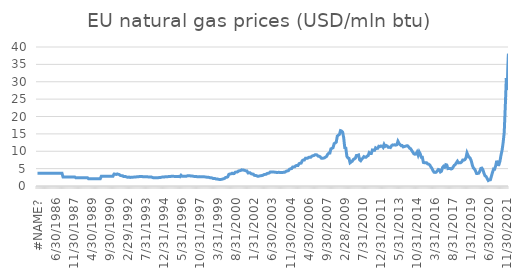
| Category | EU natural gas prices (USD/mln btu) |
|---|---|
| 0.0 | 3.65 |
| 1985-02-28 | 3.65 |
| 1985-03-31 | 3.65 |
| 1985-04-30 | 3.65 |
| 1985-05-31 | 3.65 |
| 1985-06-30 | 3.65 |
| 1985-07-31 | 3.65 |
| 1985-08-31 | 3.65 |
| 1985-09-30 | 3.65 |
| 1985-10-31 | 3.65 |
| 1985-11-30 | 3.65 |
| 1985-12-31 | 3.65 |
| 1986-01-31 | 3.65 |
| 1986-02-28 | 3.65 |
| 1986-03-31 | 3.65 |
| 1986-04-30 | 3.65 |
| 1986-05-31 | 3.65 |
| 1986-06-30 | 3.65 |
| 1986-07-31 | 3.65 |
| 1986-08-31 | 3.65 |
| 1986-09-30 | 3.65 |
| 1986-10-31 | 3.65 |
| 1986-11-30 | 3.65 |
| 1986-12-31 | 3.65 |
| 1987-01-31 | 2.59 |
| 1987-02-28 | 2.59 |
| 1987-03-31 | 2.59 |
| 1987-04-30 | 2.59 |
| 1987-05-31 | 2.59 |
| 1987-06-30 | 2.59 |
| 1987-07-31 | 2.59 |
| 1987-08-31 | 2.59 |
| 1987-09-30 | 2.59 |
| 1987-10-31 | 2.59 |
| 1987-11-30 | 2.59 |
| 1987-12-31 | 2.59 |
| 1988-01-31 | 2.36 |
| 1988-02-29 | 2.36 |
| 1988-03-31 | 2.36 |
| 1988-04-30 | 2.36 |
| 1988-05-31 | 2.36 |
| 1988-06-30 | 2.36 |
| 1988-07-31 | 2.36 |
| 1988-08-31 | 2.36 |
| 1988-09-30 | 2.36 |
| 1988-10-31 | 2.36 |
| 1988-11-30 | 2.36 |
| 1988-12-31 | 2.36 |
| 1989-01-31 | 2.09 |
| 1989-02-28 | 2.09 |
| 1989-03-31 | 2.09 |
| 1989-04-30 | 2.09 |
| 1989-05-31 | 2.09 |
| 1989-06-30 | 2.09 |
| 1989-07-31 | 2.09 |
| 1989-08-31 | 2.09 |
| 1989-09-30 | 2.09 |
| 1989-10-31 | 2.09 |
| 1989-11-30 | 2.09 |
| 1989-12-31 | 2.09 |
| 1990-01-31 | 2.82 |
| 1990-02-28 | 2.82 |
| 1990-03-31 | 2.82 |
| 1990-04-30 | 2.82 |
| 1990-05-31 | 2.82 |
| 1990-06-30 | 2.82 |
| 1990-07-31 | 2.82 |
| 1990-08-31 | 2.82 |
| 1990-09-30 | 2.82 |
| 1990-10-31 | 2.82 |
| 1990-11-30 | 2.82 |
| 1990-12-31 | 2.82 |
| 1991-01-31 | 3.44 |
| 1991-02-28 | 3.41 |
| 1991-03-31 | 3.33 |
| 1991-04-30 | 3.47 |
| 1991-05-31 | 3.37 |
| 1991-06-30 | 3.29 |
| 1991-07-31 | 3 |
| 1991-08-31 | 2.98 |
| 1991-09-30 | 2.97 |
| 1991-10-31 | 2.71 |
| 1991-11-30 | 2.7 |
| 1991-12-31 | 2.7 |
| 1992-01-31 | 2.57 |
| 1992-02-29 | 2.5 |
| 1992-03-31 | 2.58 |
| 1992-04-30 | 2.47 |
| 1992-05-31 | 2.49 |
| 1992-06-30 | 2.5 |
| 1992-07-31 | 2.55 |
| 1992-08-31 | 2.56 |
| 1992-09-30 | 2.57 |
| 1992-10-31 | 2.63 |
| 1992-11-30 | 2.64 |
| 1992-12-31 | 2.64 |
| 1993-01-31 | 2.76 |
| 1993-02-28 | 2.74 |
| 1993-03-31 | 2.75 |
| 1993-04-30 | 2.68 |
| 1993-05-31 | 2.68 |
| 1993-06-30 | 2.68 |
| 1993-07-31 | 2.66 |
| 1993-08-31 | 2.65 |
| 1993-09-30 | 2.62 |
| 1993-10-31 | 2.62 |
| 1993-11-30 | 2.62 |
| 1993-12-31 | 2.6 |
| 1994-01-31 | 2.47 |
| 1994-02-28 | 2.36 |
| 1994-03-31 | 2.36 |
| 1994-04-30 | 2.36 |
| 1994-05-31 | 2.36 |
| 1994-06-30 | 2.36 |
| 1994-07-31 | 2.42 |
| 1994-08-31 | 2.46 |
| 1994-09-30 | 2.48 |
| 1994-10-31 | 2.56 |
| 1994-11-30 | 2.57 |
| 1994-12-31 | 2.56 |
| 1995-01-31 | 2.66 |
| 1995-02-28 | 2.66 |
| 1995-03-31 | 2.65 |
| 1995-04-30 | 2.71 |
| 1995-05-31 | 2.71 |
| 1995-06-30 | 2.73 |
| 1995-07-31 | 2.8 |
| 1995-08-31 | 2.8 |
| 1995-09-30 | 2.78 |
| 1995-10-31 | 2.75 |
| 1995-11-30 | 2.75 |
| 1995-12-31 | 2.73 |
| 1996-01-31 | 2.75 |
| 1996-02-29 | 2.77 |
| 1996-03-31 | 2.67 |
| 1996-04-30 | 3.1 |
| 1996-05-31 | 2.81 |
| 1996-06-30 | 2.81 |
| 1996-07-31 | 2.78 |
| 1996-08-31 | 2.79 |
| 1996-09-30 | 2.79 |
| 1996-10-31 | 2.94 |
| 1996-11-30 | 2.96 |
| 1996-12-31 | 2.96 |
| 1997-01-31 | 2.89 |
| 1997-02-28 | 2.89 |
| 1997-03-31 | 2.83 |
| 1997-04-30 | 2.77 |
| 1997-05-31 | 2.74 |
| 1997-06-30 | 2.76 |
| 1997-07-31 | 2.67 |
| 1997-08-31 | 2.67 |
| 1997-09-30 | 2.7 |
| 1997-10-31 | 2.63 |
| 1997-11-30 | 2.66 |
| 1997-12-31 | 2.65 |
| 1998-01-31 | 2.65 |
| 1998-02-28 | 2.63 |
| 1998-03-31 | 2.61 |
| 1998-04-30 | 2.54 |
| 1998-05-31 | 2.51 |
| 1998-06-30 | 2.5 |
| 1998-07-31 | 2.4 |
| 1998-08-31 | 2.37 |
| 1998-09-30 | 2.33 |
| 1998-10-31 | 2.17 |
| 1998-11-30 | 2.15 |
| 1998-12-31 | 2.13 |
| 1999-01-31 | 2.02 |
| 1999-02-28 | 2.01 |
| 1999-03-31 | 1.95 |
| 1999-04-30 | 1.87 |
| 1999-05-31 | 1.89 |
| 1999-06-30 | 1.91 |
| 1999-07-31 | 2 |
| 1999-08-31 | 2.08 |
| 1999-09-30 | 2.2 |
| 1999-10-31 | 2.47 |
| 1999-11-30 | 2.51 |
| 1999-12-31 | 2.66 |
| 2000-01-31 | 3.36 |
| 2000-02-29 | 3.46 |
| 2000-03-31 | 3.51 |
| 2000-04-30 | 3.68 |
| 2000-05-31 | 3.55 |
| 2000-06-30 | 3.6 |
| 2000-07-31 | 3.96 |
| 2000-08-31 | 4.01 |
| 2000-09-30 | 4.03 |
| 2000-10-31 | 4.31 |
| 2000-11-30 | 4.39 |
| 2000-12-31 | 4.44 |
| 2001-01-31 | 4.65 |
| 2001-02-28 | 4.59 |
| 2001-03-31 | 4.57 |
| 2001-04-30 | 4.48 |
| 2001-05-31 | 4.36 |
| 2001-06-30 | 4.33 |
| 2001-07-31 | 3.75 |
| 2001-08-31 | 3.79 |
| 2001-09-30 | 3.79 |
| 2001-10-31 | 3.52 |
| 2001-11-30 | 3.46 |
| 2001-12-31 | 3.4 |
| 2002-01-31 | 3.06 |
| 2002-02-28 | 3.03 |
| 2002-03-31 | 2.97 |
| 2002-04-30 | 2.81 |
| 2002-05-31 | 2.83 |
| 2002-06-30 | 2.9 |
| 2002-07-31 | 2.95 |
| 2002-08-31 | 3.01 |
| 2002-09-30 | 3.08 |
| 2002-10-31 | 3.28 |
| 2002-11-30 | 3.34 |
| 2002-12-31 | 3.36 |
| 2003-01-31 | 3.61 |
| 2003-02-28 | 3.67 |
| 2003-03-31 | 3.74 |
| 2003-04-30 | 4.03 |
| 2003-05-31 | 4.04 |
| 2003-06-30 | 4.05 |
| 2003-07-31 | 4.04 |
| 2003-08-31 | 3.98 |
| 2003-09-30 | 3.97 |
| 2003-10-31 | 3.88 |
| 2003-11-30 | 3.9 |
| 2003-12-31 | 3.97 |
| 2004-01-31 | 3.87 |
| 2004-02-29 | 3.89 |
| 2004-03-31 | 3.86 |
| 2004-04-30 | 3.92 |
| 2004-05-31 | 3.95 |
| 2004-06-30 | 4.01 |
| 2004-07-31 | 4.28 |
| 2004-08-31 | 4.34 |
| 2004-09-30 | 4.41 |
| 2004-10-31 | 4.83 |
| 2004-11-30 | 4.96 |
| 2004-12-31 | 5.01 |
| 2005-01-31 | 5.46 |
| 2005-02-28 | 5.49 |
| 2005-03-31 | 5.52 |
| 2005-04-30 | 5.86 |
| 2005-05-31 | 5.89 |
| 2005-06-30 | 5.91 |
| 2005-07-31 | 6.42 |
| 2005-08-31 | 6.56 |
| 2005-09-30 | 6.58 |
| 2005-10-31 | 7.28 |
| 2005-11-30 | 7.46 |
| 2005-12-31 | 7.49 |
| 2006-01-31 | 7.96 |
| 2006-02-28 | 7.95 |
| 2006-03-31 | 7.99 |
| 2006-04-30 | 8.24 |
| 2006-05-31 | 8.28 |
| 2006-06-30 | 8.29 |
| 2006-07-31 | 8.58 |
| 2006-08-31 | 8.71 |
| 2006-09-30 | 8.77 |
| 2006-10-31 | 8.97 |
| 2006-11-30 | 8.99 |
| 2006-12-31 | 8.92 |
| 2007-01-31 | 8.59 |
| 2007-02-28 | 8.56 |
| 2007-03-31 | 8.37 |
| 2007-04-30 | 8 |
| 2007-05-31 | 7.98 |
| 2007-06-30 | 8.03 |
| 2007-07-31 | 8.13 |
| 2007-08-31 | 8.34 |
| 2007-09-30 | 8.54 |
| 2007-10-31 | 9.16 |
| 2007-11-30 | 9.47 |
| 2007-12-31 | 9.49 |
| 2008-01-31 | 10.7 |
| 2008-02-29 | 10.84 |
| 2008-03-31 | 11.04 |
| 2008-04-30 | 12.19 |
| 2008-05-31 | 12.38 |
| 2008-06-30 | 12.63 |
| 2008-07-31 | 14.37 |
| 2008-08-31 | 14.64 |
| 2008-09-30 | 14.85 |
| 2008-10-31 | 15.93 |
| 2008-11-30 | 15.81 |
| 2008-12-31 | 15.5 |
| 2009-01-31 | 13.89 |
| 2009-02-28 | 11.04 |
| 2009-03-31 | 10.9 |
| 2009-04-30 | 8.51 |
| 2009-05-31 | 8.09 |
| 2009-06-30 | 7.95 |
| 2009-07-31 | 6.67 |
| 2009-08-31 | 6.92 |
| 2009-09-30 | 7.13 |
| 2009-10-31 | 7.6 |
| 2009-11-30 | 7.81 |
| 2009-12-31 | 8.01 |
| 2010-01-31 | 8.8 |
| 2010-02-28 | 8.8 |
| 2010-03-31 | 8.93 |
| 2010-04-30 | 7.52 |
| 2010-05-31 | 7.27 |
| 2010-06-30 | 7.74 |
| 2010-07-31 | 8.04 |
| 2010-08-31 | 8.45 |
| 2010-09-30 | 8.28 |
| 2010-10-31 | 8.29 |
| 2010-11-30 | 8.59 |
| 2010-12-31 | 8.74 |
| 2011-01-31 | 9.61 |
| 2011-02-28 | 9.36 |
| 2011-03-31 | 9.37 |
| 2011-04-30 | 10.36 |
| 2011-05-31 | 10.3 |
| 2011-06-30 | 10.26 |
| 2011-07-31 | 10.99 |
| 2011-08-31 | 10.81 |
| 2011-09-30 | 10.85 |
| 2011-10-31 | 11.42 |
| 2011-11-30 | 11.32 |
| 2011-12-31 | 11.53 |
| 2012-01-31 | 11.45 |
| 2012-02-29 | 11.12 |
| 2012-03-31 | 11.97 |
| 2012-04-30 | 11.42 |
| 2012-05-31 | 11.64 |
| 2012-06-30 | 11.49 |
| 2012-07-31 | 11.13 |
| 2012-08-31 | 11.18 |
| 2012-09-30 | 11.08 |
| 2012-10-31 | 11.58 |
| 2012-11-30 | 11.83 |
| 2012-12-31 | 11.79 |
| 2013-01-31 | 11.87 |
| 2013-02-28 | 11.77 |
| 2013-03-31 | 11.87 |
| 2013-04-30 | 12.88 |
| 2013-05-31 | 12.29 |
| 2013-06-30 | 11.92 |
| 2013-07-31 | 11.6 |
| 2013-08-31 | 11.64 |
| 2013-09-30 | 11.25 |
| 2013-10-31 | 11.37 |
| 2013-11-30 | 11.42 |
| 2013-12-31 | 11.55 |
| 2014-01-31 | 11.59 |
| 2014-02-28 | 11.3 |
| 2014-03-31 | 10.88 |
| 2014-04-30 | 10.73 |
| 2014-05-31 | 10.2 |
| 2014-06-30 | 9.77 |
| 2014-07-31 | 9.27 |
| 2014-08-31 | 9.14 |
| 2014-09-30 | 9.24 |
| 2014-10-31 | 9.77 |
| 2014-11-30 | 8.9 |
| 2014-12-31 | 9.83 |
| 2015-01-31 | 9.25 |
| 2015-02-28 | 8.27 |
| 2015-03-31 | 8.27 |
| 2015-04-30 | 6.77 |
| 2015-05-31 | 6.68 |
| 2015-06-30 | 6.67 |
| 2015-07-31 | 6.69 |
| 2015-08-31 | 6.35 |
| 2015-09-30 | 6.28 |
| 2015-10-31 | 6.03 |
| 2015-11-30 | 5.5 |
| 2015-12-31 | 5.09 |
| 2016-01-31 | 4.4 |
| 2016-02-29 | 3.97 |
| 2016-03-31 | 3.91 |
| 2016-04-30 | 3.97 |
| 2016-05-31 | 4.33 |
| 2016-06-30 | 4.76 |
| 2016-07-31 | 4.67 |
| 2016-08-31 | 4.05 |
| 2016-09-30 | 4.25 |
| 2016-10-31 | 5.34 |
| 2016-11-30 | 5.69 |
| 2016-12-31 | 5.42 |
| 2017-01-31 | 6.14 |
| 2017-02-28 | 6.05 |
| 2017-03-31 | 5 |
| 2017-04-30 | 5.01 |
| 2017-05-31 | 5.06 |
| 2017-06-30 | 4.89 |
| 2017-07-31 | 5 |
| 2017-08-31 | 5.48 |
| 2017-09-30 | 5.96 |
| 2017-10-31 | 6.18 |
| 2017-11-30 | 6.69 |
| 2017-12-31 | 7.14 |
| 2018-01-31 | 6.66 |
| 2018-02-28 | 6.72 |
| 2018-03-31 | 6.7 |
| 2018-04-30 | 6.93 |
| 2018-05-31 | 7.49 |
| 2018-06-30 | 7.45 |
| 2018-07-31 | 7.6 |
| 2018-08-31 | 8.08 |
| 2018-09-30 | 9.52 |
| 2018-10-31 | 8.79 |
| 2018-11-30 | 8.27 |
| 2018-12-31 | 7.98 |
| 2019-01-31 | 7.26 |
| 2019-02-28 | 6.01 |
| 2019-03-31 | 5.18 |
| 2019-04-30 | 4.92 |
| 2019-05-31 | 4.34 |
| 2019-06-30 | 3.59 |
| 2019-07-31 | 3.62 |
| 2019-08-31 | 3.68 |
| 2019-09-30 | 4.21 |
| 2019-10-31 | 5.06 |
| 2019-11-30 | 5.15 |
| 2019-12-31 | 4.62 |
| 2020-01-31 | 3.63 |
| 2020-02-29 | 2.91 |
| 2020-03-31 | 2.72 |
| 2020-04-30 | 2.12 |
| 2020-05-31 | 1.58 |
| 2020-06-30 | 1.75 |
| 2020-07-31 | 1.8 |
| 2020-08-31 | 2.86 |
| 2020-09-30 | 3.95 |
| 2020-10-31 | 4.89 |
| 2020-11-30 | 4.84 |
| 2020-12-31 | 5.86 |
| 2021-01-31 | 7.27 |
| 2021-02-28 | 6.16 |
| 2021-03-31 | 6.13 |
| 2021-04-30 | 7.15 |
| 2021-05-31 | 8.91 |
| 2021-06-30 | 10.3 |
| 2021-07-31 | 12.51 |
| 2021-08-31 | 15.43 |
| 2021-09-30 | 22.84 |
| 2021-10-31 | 31.05 |
| 2021-11-30 | 27.62 |
| 2021-12-31 | 38.03 |